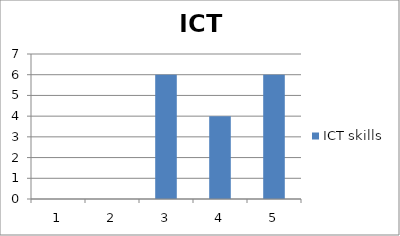
| Category | ICT skills |
|---|---|
| 0 | 0 |
| 1 | 0 |
| 2 | 6 |
| 3 | 4 |
| 4 | 6 |